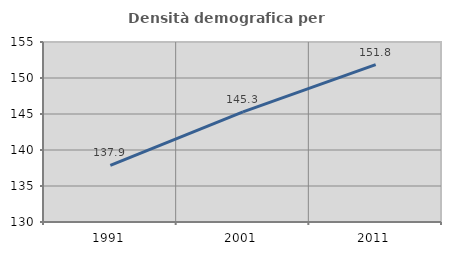
| Category | Densità demografica |
|---|---|
| 1991.0 | 137.879 |
| 2001.0 | 145.303 |
| 2011.0 | 151.85 |